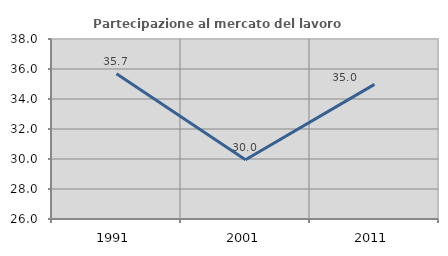
| Category | Partecipazione al mercato del lavoro  femminile |
|---|---|
| 1991.0 | 35.691 |
| 2001.0 | 29.95 |
| 2011.0 | 34.975 |